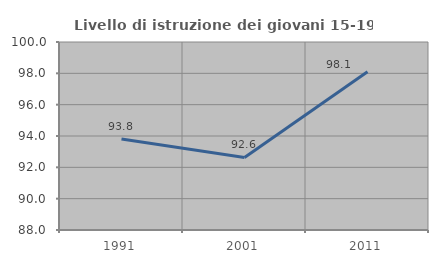
| Category | Livello di istruzione dei giovani 15-19 anni |
|---|---|
| 1991.0 | 93.805 |
| 2001.0 | 92.632 |
| 2011.0 | 98.095 |